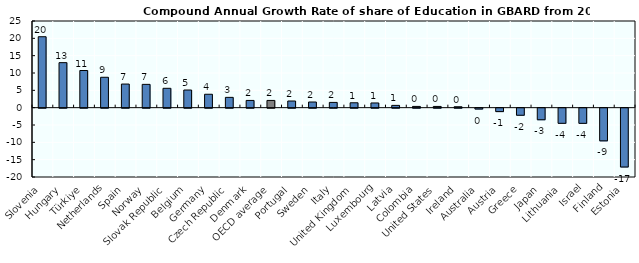
| Category | Chile |
|---|---|
| Slovenia | 20.463 |
| Hungary | 12.986 |
| Türkiye | 10.72 |
| Netherlands | 8.768 |
| Spain | 6.811 |
| Norway | 6.722 |
| Slovak Republic | 5.584 |
| Belgium | 5.096 |
| Germany | 3.869 |
| Czech Republic | 2.973 |
| Denmark | 2.09 |
| OECD average | 2.088 |
| Portugal | 1.919 |
| Sweden | 1.633 |
| Italy | 1.515 |
| United Kingdom | 1.412 |
| Luxembourg | 1.36 |
| Latvia | 0.659 |
| Colombia | 0.359 |
| United States | 0.358 |
| Ireland | 0.268 |
| Australia | -0.253 |
| Austria | -0.99 |
| Greece | -2.046 |
| Japan | -3.342 |
| Lithuania | -4.372 |
| Israel | -4.382 |
| Finland | -9.428 |
| Estonia | -16.974 |